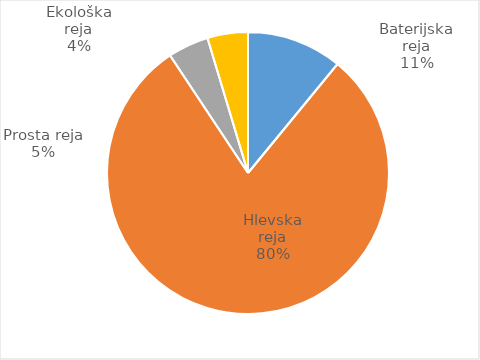
| Category | Količina kosov jajc |
|---|---|
| Baterijska reja | 287408 |
| Hlevska reja | 2094693 |
| Prosta reja | 122940 |
| Ekološka reja | 121960 |